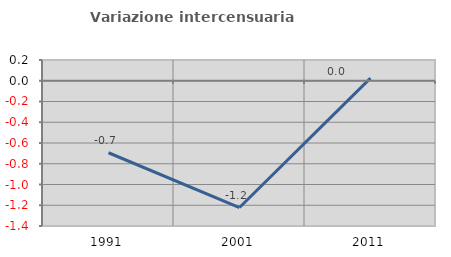
| Category | Variazione intercensuaria annua |
|---|---|
| 1991.0 | -0.694 |
| 2001.0 | -1.222 |
| 2011.0 | 0.025 |